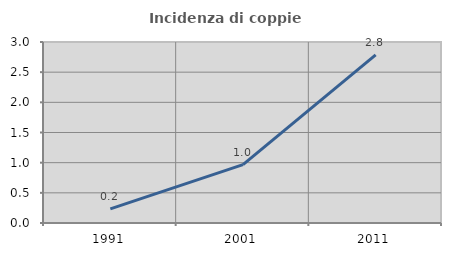
| Category | Incidenza di coppie miste |
|---|---|
| 1991.0 | 0.235 |
| 2001.0 | 0.969 |
| 2011.0 | 2.785 |